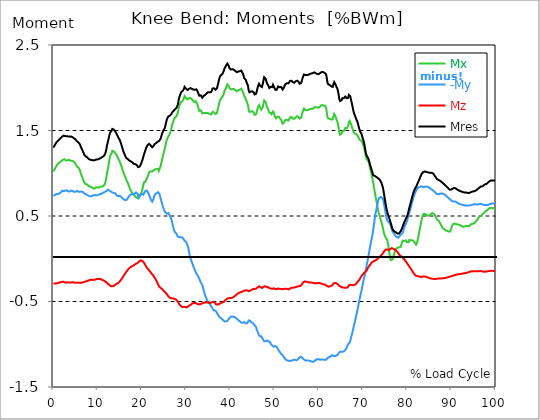
| Category |  Mx |  -My |  Mz |  Mres |
|---|---|---|---|---|
| 0.0 | 1.019 | 0.736 | -0.29 | 1.3 |
| 0.167348456675344 | 1.036 | 0.74 | -0.289 | 1.315 |
| 0.334696913350688 | 1.052 | 0.744 | -0.289 | 1.329 |
| 0.5020453700260321 | 1.068 | 0.75 | -0.288 | 1.345 |
| 0.669393826701376 | 1.083 | 0.757 | -0.288 | 1.361 |
| 0.83674228337672 | 1.097 | 0.756 | -0.286 | 1.37 |
| 1.0040907400520642 | 1.108 | 0.756 | -0.284 | 1.379 |
| 1.1621420602454444 | 1.117 | 0.758 | -0.283 | 1.386 |
| 1.3294905169207885 | 1.125 | 0.763 | -0.28 | 1.394 |
| 1.4968389735961325 | 1.132 | 0.77 | -0.277 | 1.403 |
| 1.6641874302714765 | 1.14 | 0.775 | -0.273 | 1.412 |
| 1.8315358869468206 | 1.144 | 0.786 | -0.272 | 1.42 |
| 1.9988843436221646 | 1.15 | 0.796 | -0.27 | 1.429 |
| 2.1662328002975086 | 1.158 | 0.795 | -0.269 | 1.436 |
| 2.333581256972853 | 1.167 | 0.79 | -0.27 | 1.44 |
| 2.5009297136481967 | 1.165 | 0.79 | -0.275 | 1.439 |
| 2.6682781703235405 | 1.153 | 0.797 | -0.279 | 1.435 |
| 2.8356266269988843 | 1.149 | 0.8 | -0.28 | 1.433 |
| 3.002975083674229 | 1.149 | 0.8 | -0.279 | 1.433 |
| 3.1703235403495724 | 1.151 | 0.798 | -0.276 | 1.433 |
| 3.337671997024917 | 1.154 | 0.789 | -0.276 | 1.431 |
| 3.4957233172182973 | 1.157 | 0.783 | -0.277 | 1.43 |
| 3.663071773893641 | 1.154 | 0.785 | -0.279 | 1.429 |
| 3.8304202305689854 | 1.149 | 0.793 | -0.279 | 1.428 |
| 3.997768687244329 | 1.147 | 0.798 | -0.278 | 1.429 |
| 4.165117143919673 | 1.145 | 0.798 | -0.276 | 1.427 |
| 4.332465600595017 | 1.141 | 0.793 | -0.274 | 1.421 |
| 4.499814057270361 | 1.141 | 0.785 | -0.275 | 1.417 |
| 4.667162513945706 | 1.132 | 0.783 | -0.277 | 1.41 |
| 4.834510970621049 | 1.122 | 0.782 | -0.278 | 1.402 |
| 5.001859427296393 | 1.112 | 0.783 | -0.281 | 1.395 |
| 5.169207883971737 | 1.094 | 0.79 | -0.28 | 1.384 |
| 5.336556340647081 | 1.079 | 0.793 | -0.28 | 1.374 |
| 5.503904797322425 | 1.072 | 0.79 | -0.278 | 1.367 |
| 5.671253253997769 | 1.067 | 0.784 | -0.279 | 1.36 |
| 5.82930457419115 | 1.058 | 0.781 | -0.28 | 1.352 |
| 5.996653030866494 | 1.037 | 0.783 | -0.282 | 1.338 |
| 6.164001487541838 | 1.003 | 0.786 | -0.282 | 1.314 |
| 6.331349944217181 | 0.98 | 0.786 | -0.28 | 1.296 |
| 6.498698400892526 | 0.958 | 0.783 | -0.279 | 1.278 |
| 6.66604685756787 | 0.93 | 0.781 | -0.278 | 1.256 |
| 6.833395314243213 | 0.91 | 0.778 | -0.276 | 1.239 |
| 7.000743770918558 | 0.888 | 0.764 | -0.271 | 1.215 |
| 7.168092227593902 | 0.883 | 0.759 | -0.268 | 1.207 |
| 7.335440684269246 | 0.873 | 0.756 | -0.265 | 1.197 |
| 7.50278914094459 | 0.867 | 0.752 | -0.263 | 1.191 |
| 7.6701375976199335 | 0.867 | 0.745 | -0.26 | 1.185 |
| 7.837486054295278 | 0.859 | 0.74 | -0.257 | 1.176 |
| 7.995537374488658 | 0.85 | 0.736 | -0.253 | 1.166 |
| 8.162885831164003 | 0.847 | 0.732 | -0.25 | 1.161 |
| 8.330234287839346 | 0.844 | 0.73 | -0.247 | 1.158 |
| 8.49758274451469 | 0.84 | 0.73 | -0.245 | 1.156 |
| 8.664931201190035 | 0.836 | 0.732 | -0.246 | 1.154 |
| 8.832279657865378 | 0.829 | 0.736 | -0.248 | 1.152 |
| 8.999628114540721 | 0.822 | 0.742 | -0.248 | 1.151 |
| 9.166976571216066 | 0.821 | 0.744 | -0.247 | 1.15 |
| 9.334325027891412 | 0.821 | 0.746 | -0.246 | 1.151 |
| 9.501673484566755 | 0.827 | 0.746 | -0.243 | 1.155 |
| 9.669021941242098 | 0.837 | 0.742 | -0.24 | 1.161 |
| 9.836370397917442 | 0.837 | 0.741 | -0.238 | 1.161 |
| 10.003718854592787 | 0.833 | 0.744 | -0.236 | 1.161 |
| 10.17106731126813 | 0.832 | 0.749 | -0.235 | 1.163 |
| 10.329118631461512 | 0.833 | 0.752 | -0.235 | 1.168 |
| 10.496467088136853 | 0.841 | 0.755 | -0.234 | 1.174 |
| 10.663815544812199 | 0.843 | 0.756 | -0.237 | 1.178 |
| 10.831164001487544 | 0.842 | 0.758 | -0.242 | 1.181 |
| 10.998512458162887 | 0.845 | 0.764 | -0.247 | 1.187 |
| 11.16586091483823 | 0.85 | 0.769 | -0.25 | 1.194 |
| 11.333209371513574 | 0.851 | 0.773 | -0.254 | 1.199 |
| 11.50055782818892 | 0.857 | 0.78 | -0.258 | 1.208 |
| 11.667906284864264 | 0.877 | 0.783 | -0.262 | 1.221 |
| 11.835254741539607 | 0.915 | 0.784 | -0.269 | 1.249 |
| 12.00260319821495 | 0.959 | 0.792 | -0.278 | 1.286 |
| 12.169951654890292 | 1.012 | 0.803 | -0.287 | 1.334 |
| 12.337300111565641 | 1.054 | 0.809 | -0.294 | 1.37 |
| 12.504648568240984 | 1.103 | 0.807 | -0.299 | 1.406 |
| 12.662699888434362 | 1.161 | 0.798 | -0.306 | 1.447 |
| 12.830048345109708 | 1.203 | 0.787 | -0.314 | 1.475 |
| 12.997396801785053 | 1.213 | 0.786 | -0.321 | 1.483 |
| 13.164745258460396 | 1.234 | 0.783 | -0.322 | 1.5 |
| 13.33209371513574 | 1.262 | 0.775 | -0.321 | 1.518 |
| 13.499442171811083 | 1.269 | 0.767 | -0.321 | 1.519 |
| 13.666790628486426 | 1.255 | 0.769 | -0.318 | 1.51 |
| 13.834139085161771 | 1.243 | 0.771 | -0.312 | 1.5 |
| 14.001487541837117 | 1.231 | 0.766 | -0.303 | 1.487 |
| 14.16883599851246 | 1.222 | 0.755 | -0.297 | 1.475 |
| 14.336184455187803 | 1.217 | 0.74 | -0.293 | 1.463 |
| 14.503532911863147 | 1.193 | 0.732 | -0.289 | 1.439 |
| 14.670881368538492 | 1.171 | 0.732 | -0.283 | 1.419 |
| 14.828932688731873 | 1.154 | 0.734 | -0.275 | 1.405 |
| 14.996281145407215 | 1.138 | 0.736 | -0.266 | 1.391 |
| 15.163629602082558 | 1.127 | 0.736 | -0.254 | 1.38 |
| 15.330978058757903 | 1.091 | 0.723 | -0.244 | 1.342 |
| 15.498326515433247 | 1.063 | 0.715 | -0.23 | 1.312 |
| 15.665674972108594 | 1.036 | 0.705 | -0.217 | 1.283 |
| 15.833023428783937 | 1.011 | 0.697 | -0.203 | 1.255 |
| 16.00037188545928 | 0.988 | 0.691 | -0.189 | 1.234 |
| 16.167720342134626 | 0.966 | 0.686 | -0.177 | 1.213 |
| 16.335068798809967 | 0.945 | 0.684 | -0.164 | 1.194 |
| 16.502417255485312 | 0.922 | 0.685 | -0.152 | 1.178 |
| 16.669765712160658 | 0.906 | 0.695 | -0.142 | 1.171 |
| 16.837114168836 | 0.886 | 0.709 | -0.13 | 1.166 |
| 17.004462625511344 | 0.863 | 0.723 | -0.118 | 1.159 |
| 17.16251394570472 | 0.839 | 0.732 | -0.107 | 1.15 |
| 17.32986240238007 | 0.815 | 0.744 | -0.103 | 1.143 |
| 17.497210859055414 | 0.799 | 0.75 | -0.098 | 1.139 |
| 17.664559315730756 | 0.783 | 0.756 | -0.092 | 1.134 |
| 17.8319077724061 | 0.77 | 0.76 | -0.087 | 1.128 |
| 17.999256229081443 | 0.756 | 0.757 | -0.083 | 1.118 |
| 18.166604685756788 | 0.745 | 0.755 | -0.078 | 1.11 |
| 18.333953142432133 | 0.737 | 0.761 | -0.071 | 1.107 |
| 18.501301599107478 | 0.73 | 0.771 | -0.064 | 1.108 |
| 18.668650055782823 | 0.718 | 0.775 | -0.058 | 1.103 |
| 18.835998512458165 | 0.711 | 0.775 | -0.053 | 1.097 |
| 19.00334696913351 | 0.71 | 0.759 | -0.05 | 1.085 |
| 19.170695425808855 | 0.718 | 0.737 | -0.043 | 1.072 |
| 19.338043882484197 | 0.749 | 0.713 | -0.034 | 1.069 |
| 19.496095202677576 | 0.742 | 0.727 | -0.025 | 1.077 |
| 19.66344365935292 | 0.75 | 0.743 | -0.02 | 1.093 |
| 19.830792116028263 | 0.762 | 0.754 | -0.018 | 1.112 |
| 19.998140572703612 | 0.784 | 0.76 | -0.022 | 1.134 |
| 20.165489029378953 | 0.821 | 0.752 | -0.029 | 1.159 |
| 20.3328374860543 | 0.861 | 0.75 | -0.036 | 1.19 |
| 20.500185942729644 | 0.896 | 0.749 | -0.046 | 1.223 |
| 20.667534399404985 | 0.894 | 0.78 | -0.061 | 1.247 |
| 20.83488285608033 | 0.902 | 0.796 | -0.078 | 1.273 |
| 21.002231312755672 | 0.926 | 0.793 | -0.093 | 1.3 |
| 21.16957976943102 | 0.938 | 0.795 | -0.107 | 1.315 |
| 21.336928226106362 | 0.961 | 0.786 | -0.117 | 1.331 |
| 21.504276682781704 | 0.988 | 0.766 | -0.127 | 1.341 |
| 21.67162513945705 | 1.011 | 0.744 | -0.137 | 1.344 |
| 21.82967645965043 | 1.022 | 0.723 | -0.148 | 1.34 |
| 21.997024916325774 | 1.022 | 0.698 | -0.159 | 1.325 |
| 22.16437337300112 | 1.022 | 0.682 | -0.171 | 1.315 |
| 22.33172182967646 | 1.02 | 0.668 | -0.181 | 1.304 |
| 22.499070286351806 | 1.022 | 0.668 | -0.19 | 1.303 |
| 22.666418743027148 | 1.034 | 0.701 | -0.204 | 1.32 |
| 22.833767199702496 | 1.045 | 0.739 | -0.217 | 1.339 |
| 23.00111565637784 | 1.047 | 0.753 | -0.23 | 1.346 |
| 23.168464113053183 | 1.047 | 0.761 | -0.244 | 1.35 |
| 23.335812569728528 | 1.049 | 0.767 | -0.261 | 1.357 |
| 23.50316102640387 | 1.051 | 0.772 | -0.28 | 1.367 |
| 23.670509483079215 | 1.051 | 0.779 | -0.298 | 1.376 |
| 23.83785793975456 | 1.029 | 0.787 | -0.317 | 1.375 |
| 23.995909259947936 | 1.05 | 0.757 | -0.329 | 1.384 |
| 24.163257716623285 | 1.071 | 0.722 | -0.339 | 1.395 |
| 24.330606173298627 | 1.102 | 0.69 | -0.346 | 1.419 |
| 24.49795462997397 | 1.143 | 0.658 | -0.351 | 1.449 |
| 24.665303086649313 | 1.181 | 0.629 | -0.358 | 1.475 |
| 24.83265154332466 | 1.217 | 0.601 | -0.367 | 1.497 |
| 25.0 | 1.247 | 0.575 | -0.379 | 1.503 |
| 25.167348456675345 | 1.282 | 0.555 | -0.386 | 1.525 |
| 25.334696913350694 | 1.32 | 0.541 | -0.395 | 1.558 |
| 25.502045370026035 | 1.363 | 0.531 | -0.404 | 1.597 |
| 25.669393826701377 | 1.396 | 0.526 | -0.416 | 1.629 |
| 25.836742283376722 | 1.414 | 0.531 | -0.428 | 1.65 |
| 26.004090740052067 | 1.429 | 0.535 | -0.44 | 1.665 |
| 26.17143919672741 | 1.446 | 0.519 | -0.45 | 1.669 |
| 26.329490516920792 | 1.464 | 0.505 | -0.455 | 1.673 |
| 26.49683897359613 | 1.484 | 0.486 | -0.459 | 1.676 |
| 26.66418743027148 | 1.521 | 0.46 | -0.461 | 1.691 |
| 26.831535886946828 | 1.562 | 0.432 | -0.463 | 1.712 |
| 26.998884343622166 | 1.591 | 0.389 | -0.463 | 1.718 |
| 27.166232800297514 | 1.616 | 0.358 | -0.465 | 1.729 |
| 27.333581256972852 | 1.639 | 0.327 | -0.466 | 1.74 |
| 27.5009297136482 | 1.651 | 0.312 | -0.471 | 1.749 |
| 27.668278170323543 | 1.66 | 0.302 | -0.477 | 1.756 |
| 27.835626626998888 | 1.667 | 0.293 | -0.483 | 1.764 |
| 28.002975083674233 | 1.69 | 0.272 | -0.488 | 1.784 |
| 28.170323540349575 | 1.711 | 0.257 | -0.502 | 1.807 |
| 28.33767199702492 | 1.757 | 0.248 | -0.519 | 1.855 |
| 28.50502045370026 | 1.79 | 0.252 | -0.534 | 1.893 |
| 28.663071773893645 | 1.812 | 0.253 | -0.542 | 1.917 |
| 28.830420230568986 | 1.832 | 0.252 | -0.552 | 1.941 |
| 28.99776868724433 | 1.842 | 0.251 | -0.561 | 1.954 |
| 29.165117143919673 | 1.843 | 0.249 | -0.565 | 1.958 |
| 29.33246560059502 | 1.853 | 0.24 | -0.565 | 1.969 |
| 29.499814057270367 | 1.873 | 0.225 | -0.562 | 1.985 |
| 29.66716251394571 | 1.903 | 0.21 | -0.56 | 2.011 |
| 29.834510970621054 | 1.893 | 0.206 | -0.564 | 2.002 |
| 30.00185942729639 | 1.88 | 0.198 | -0.568 | 1.989 |
| 30.169207883971744 | 1.868 | 0.188 | -0.57 | 1.979 |
| 30.33655634064708 | 1.864 | 0.16 | -0.563 | 1.974 |
| 30.50390479732243 | 1.873 | 0.13 | -0.556 | 1.98 |
| 30.671253253997772 | 1.879 | 0.086 | -0.55 | 1.986 |
| 30.829304574191156 | 1.877 | 0.036 | -0.545 | 1.988 |
| 30.996653030866494 | 1.88 | 0.002 | -0.543 | 1.997 |
| 31.164001487541842 | 1.872 | -0.018 | -0.535 | 1.992 |
| 31.331349944217187 | 1.862 | -0.042 | -0.526 | 1.986 |
| 31.498698400892525 | 1.853 | -0.066 | -0.519 | 1.982 |
| 31.666046857567874 | 1.845 | -0.092 | -0.519 | 1.979 |
| 31.833395314243212 | 1.832 | -0.113 | -0.518 | 1.97 |
| 32.00074377091856 | 1.838 | -0.124 | -0.518 | 1.977 |
| 32.1680922275939 | 1.843 | -0.15 | -0.518 | 1.986 |
| 32.33544068426925 | 1.83 | -0.172 | -0.523 | 1.982 |
| 32.50278914094459 | 1.814 | -0.185 | -0.527 | 1.969 |
| 32.670137597619934 | 1.787 | -0.199 | -0.531 | 1.949 |
| 32.83748605429528 | 1.756 | -0.215 | -0.534 | 1.926 |
| 33.004834510970625 | 1.729 | -0.235 | -0.537 | 1.907 |
| 33.162885831164004 | 1.73 | -0.255 | -0.532 | 1.906 |
| 33.33023428783935 | 1.735 | -0.279 | -0.527 | 1.912 |
| 33.497582744514695 | 1.722 | -0.291 | -0.524 | 1.901 |
| 33.664931201190036 | 1.7 | -0.309 | -0.521 | 1.883 |
| 33.83227965786538 | 1.698 | -0.337 | -0.517 | 1.888 |
| 33.99962811454073 | 1.705 | -0.373 | -0.513 | 1.906 |
| 34.16697657121607 | 1.701 | -0.402 | -0.513 | 1.907 |
| 34.33432502789141 | 1.703 | -0.429 | -0.511 | 1.917 |
| 34.50167348456676 | 1.705 | -0.452 | -0.51 | 1.927 |
| 34.6690219412421 | 1.705 | -0.474 | -0.512 | 1.935 |
| 34.83637039791744 | 1.704 | -0.495 | -0.513 | 1.942 |
| 35.00371885459279 | 1.703 | -0.511 | -0.514 | 1.949 |
| 35.17106731126814 | 1.7 | -0.517 | -0.516 | 1.95 |
| 35.338415767943474 | 1.694 | -0.527 | -0.517 | 1.947 |
| 35.49646708813686 | 1.688 | -0.54 | -0.517 | 1.945 |
| 35.6638155448122 | 1.686 | -0.553 | -0.513 | 1.95 |
| 35.831164001487544 | 1.698 | -0.568 | -0.51 | 1.967 |
| 35.998512458162885 | 1.718 | -0.585 | -0.506 | 1.992 |
| 36.165860914838234 | 1.723 | -0.595 | -0.503 | 2.002 |
| 36.333209371513576 | 1.71 | -0.605 | -0.509 | 1.993 |
| 36.50055782818892 | 1.702 | -0.607 | -0.515 | 1.985 |
| 36.667906284864266 | 1.692 | -0.607 | -0.523 | 1.977 |
| 36.83525474153961 | 1.689 | -0.62 | -0.535 | 1.978 |
| 37.002603198214956 | 1.709 | -0.63 | -0.538 | 1.996 |
| 37.1699516548903 | 1.746 | -0.65 | -0.535 | 2.03 |
| 37.337300111565646 | 1.782 | -0.666 | -0.534 | 2.066 |
| 37.50464856824098 | 1.822 | -0.677 | -0.529 | 2.105 |
| 37.66269988843437 | 1.849 | -0.687 | -0.524 | 2.129 |
| 37.83004834510971 | 1.867 | -0.694 | -0.519 | 2.145 |
| 37.99739680178505 | 1.882 | -0.698 | -0.516 | 2.155 |
| 38.16474525846039 | 1.888 | -0.701 | -0.512 | 2.158 |
| 38.33209371513574 | 1.903 | -0.715 | -0.511 | 2.172 |
| 38.49944217181109 | 1.926 | -0.724 | -0.506 | 2.193 |
| 38.666790628486424 | 1.957 | -0.732 | -0.496 | 2.22 |
| 38.83413908516178 | 1.978 | -0.735 | -0.487 | 2.239 |
| 39.001487541837115 | 1.993 | -0.735 | -0.481 | 2.25 |
| 39.16883599851246 | 2.019 | -0.733 | -0.473 | 2.27 |
| 39.336184455187805 | 2.04 | -0.726 | -0.466 | 2.283 |
| 39.503532911863154 | 2.031 | -0.717 | -0.462 | 2.269 |
| 39.670881368538495 | 2.017 | -0.706 | -0.459 | 2.253 |
| 39.83822982521384 | 1.994 | -0.692 | -0.459 | 2.228 |
| 39.996281145407224 | 1.986 | -0.683 | -0.46 | 2.219 |
| 40.163629602082565 | 1.981 | -0.676 | -0.46 | 2.213 |
| 40.33097805875791 | 1.977 | -0.672 | -0.459 | 2.208 |
| 40.498326515433256 | 1.986 | -0.677 | -0.455 | 2.217 |
| 40.6656749721086 | 1.986 | -0.677 | -0.451 | 2.217 |
| 40.83302342878393 | 1.983 | -0.678 | -0.444 | 2.211 |
| 41.00037188545929 | 1.975 | -0.682 | -0.434 | 2.2 |
| 41.16772034213463 | 1.969 | -0.687 | -0.43 | 2.194 |
| 41.33506879880997 | 1.963 | -0.695 | -0.421 | 2.188 |
| 41.50241725548531 | 1.958 | -0.704 | -0.416 | 2.183 |
| 41.66976571216066 | 1.959 | -0.713 | -0.41 | 2.183 |
| 41.837114168836 | 1.973 | -0.717 | -0.402 | 2.191 |
| 42.004462625511344 | 1.973 | -0.729 | -0.399 | 2.192 |
| 42.17181108218669 | 1.977 | -0.733 | -0.395 | 2.194 |
| 42.32986240238007 | 1.983 | -0.733 | -0.393 | 2.197 |
| 42.497210859055414 | 1.987 | -0.747 | -0.388 | 2.201 |
| 42.66455931573076 | 1.978 | -0.749 | -0.383 | 2.19 |
| 42.831907772406105 | 1.954 | -0.749 | -0.381 | 2.166 |
| 42.999256229081446 | 1.931 | -0.749 | -0.377 | 2.143 |
| 43.16660468575679 | 1.9 | -0.74 | -0.376 | 2.11 |
| 43.33395314243214 | 1.887 | -0.747 | -0.372 | 2.1 |
| 43.50130159910748 | 1.878 | -0.757 | -0.368 | 2.094 |
| 43.66865005578282 | 1.846 | -0.753 | -0.369 | 2.066 |
| 43.83599851245817 | 1.836 | -0.752 | -0.371 | 2.059 |
| 44.00334696913351 | 1.799 | -0.739 | -0.376 | 2.024 |
| 44.17069542580886 | 1.742 | -0.721 | -0.38 | 1.969 |
| 44.3380438824842 | 1.717 | -0.717 | -0.38 | 1.948 |
| 44.49609520267758 | 1.719 | -0.724 | -0.374 | 1.95 |
| 44.66344365935292 | 1.721 | -0.737 | -0.369 | 1.956 |
| 44.83079211602827 | 1.727 | -0.744 | -0.363 | 1.961 |
| 44.99814057270361 | 1.725 | -0.75 | -0.359 | 1.958 |
| 45.16548902937895 | 1.735 | -0.759 | -0.352 | 1.967 |
| 45.332837486054295 | 1.711 | -0.766 | -0.352 | 1.945 |
| 45.500185942729644 | 1.683 | -0.779 | -0.354 | 1.922 |
| 45.66753439940499 | 1.679 | -0.787 | -0.354 | 1.919 |
| 45.83488285608033 | 1.69 | -0.799 | -0.35 | 1.929 |
| 46.00223131275568 | 1.717 | -0.829 | -0.343 | 1.961 |
| 46.16957976943102 | 1.754 | -0.85 | -0.334 | 1.998 |
| 46.336928226106366 | 1.782 | -0.871 | -0.328 | 2.026 |
| 46.50427668278171 | 1.797 | -0.894 | -0.323 | 2.048 |
| 46.671625139457056 | 1.79 | -0.908 | -0.323 | 2.047 |
| 46.829676459650436 | 1.758 | -0.906 | -0.331 | 2.018 |
| 46.99702491632577 | 1.743 | -0.908 | -0.34 | 2.007 |
| 47.16437337300112 | 1.74 | -0.917 | -0.343 | 2.009 |
| 47.33172182967646 | 1.771 | -0.936 | -0.337 | 2.042 |
| 47.49907028635181 | 1.812 | -0.951 | -0.329 | 2.083 |
| 47.66641874302716 | 1.851 | -0.965 | -0.321 | 2.123 |
| 47.83376719970249 | 1.853 | -0.968 | -0.321 | 2.125 |
| 48.001115656377834 | 1.833 | -0.965 | -0.323 | 2.106 |
| 48.16846411305319 | 1.799 | -0.958 | -0.328 | 2.073 |
| 48.33581256972853 | 1.772 | -0.956 | -0.333 | 2.05 |
| 48.50316102640387 | 1.775 | -0.963 | -0.33 | 2.053 |
| 48.67050948307921 | 1.735 | -0.963 | -0.338 | 2.019 |
| 48.837857939754564 | 1.707 | -0.966 | -0.344 | 1.997 |
| 49.005206396429905 | 1.707 | -0.979 | -0.346 | 2.001 |
| 49.163257716623285 | 1.708 | -0.996 | -0.349 | 2.011 |
| 49.33060617329863 | 1.691 | -1.005 | -0.351 | 2.001 |
| 49.49795462997397 | 1.695 | -1.015 | -0.35 | 2.008 |
| 49.66530308664932 | 1.722 | -1.024 | -0.344 | 2.035 |
| 49.832651543324666 | 1.709 | -1.029 | -0.346 | 2.025 |
| 50.0 | 1.677 | -1.025 | -0.351 | 1.997 |
| 50.16734845667534 | 1.655 | -1.022 | -0.354 | 1.978 |
| 50.33469691335069 | 1.643 | -1.02 | -0.357 | 1.967 |
| 50.50204537002604 | 1.649 | -1.03 | -0.355 | 1.977 |
| 50.66939382670139 | 1.662 | -1.048 | -0.351 | 1.997 |
| 50.836742283376715 | 1.673 | -1.064 | -0.348 | 2.016 |
| 51.00409074005207 | 1.658 | -1.076 | -0.35 | 2.01 |
| 51.17143919672741 | 1.646 | -1.086 | -0.352 | 2.006 |
| 51.32949051692079 | 1.637 | -1.101 | -0.352 | 2.009 |
| 51.496838973596134 | 1.626 | -1.115 | -0.352 | 2.01 |
| 51.66418743027148 | 1.604 | -1.121 | -0.354 | 1.995 |
| 51.831535886946824 | 1.581 | -1.127 | -0.356 | 1.98 |
| 51.99888434362217 | 1.579 | -1.137 | -0.355 | 1.983 |
| 52.16623280029752 | 1.593 | -1.152 | -0.353 | 2.005 |
| 52.33358125697285 | 1.612 | -1.168 | -0.35 | 2.029 |
| 52.5009297136482 | 1.625 | -1.177 | -0.35 | 2.046 |
| 52.668278170323546 | 1.632 | -1.185 | -0.35 | 2.056 |
| 52.835626626998895 | 1.623 | -1.19 | -0.353 | 2.052 |
| 53.00297508367424 | 1.615 | -1.191 | -0.358 | 2.047 |
| 53.17032354034958 | 1.617 | -1.193 | -0.358 | 2.051 |
| 53.33767199702492 | 1.633 | -1.192 | -0.355 | 2.063 |
| 53.50502045370027 | 1.651 | -1.195 | -0.349 | 2.08 |
| 53.663071773893655 | 1.662 | -1.195 | -0.343 | 2.087 |
| 53.83042023056899 | 1.657 | -1.193 | -0.338 | 2.082 |
| 53.99776868724433 | 1.649 | -1.189 | -0.338 | 2.073 |
| 54.16511714391967 | 1.64 | -1.185 | -0.338 | 2.063 |
| 54.33246560059503 | 1.635 | -1.183 | -0.338 | 2.058 |
| 54.49981405727037 | 1.637 | -1.183 | -0.337 | 2.059 |
| 54.667162513945705 | 1.638 | -1.183 | -0.337 | 2.06 |
| 54.834510970621054 | 1.657 | -1.185 | -0.331 | 2.078 |
| 55.0018594272964 | 1.664 | -1.187 | -0.327 | 2.084 |
| 55.169207883971744 | 1.667 | -1.182 | -0.324 | 2.083 |
| 55.336556340647086 | 1.668 | -1.174 | -0.321 | 2.081 |
| 55.50390479732243 | 1.655 | -1.164 | -0.32 | 2.065 |
| 55.671253253997776 | 1.639 | -1.154 | -0.32 | 2.048 |
| 55.83860171067312 | 1.636 | -1.147 | -0.318 | 2.041 |
| 55.9966530308665 | 1.65 | -1.147 | -0.312 | 2.053 |
| 56.16400148754184 | 1.681 | -1.153 | -0.3 | 2.081 |
| 56.33134994421718 | 1.712 | -1.163 | -0.288 | 2.112 |
| 56.498698400892536 | 1.735 | -1.171 | -0.277 | 2.134 |
| 56.66604685756788 | 1.756 | -1.178 | -0.265 | 2.155 |
| 56.83339531424321 | 1.748 | -1.183 | -0.265 | 2.152 |
| 57.00074377091856 | 1.738 | -1.189 | -0.266 | 2.15 |
| 57.16809222759391 | 1.735 | -1.19 | -0.268 | 2.149 |
| 57.33544068426925 | 1.736 | -1.19 | -0.271 | 2.149 |
| 57.5027891409446 | 1.738 | -1.189 | -0.274 | 2.15 |
| 57.670137597619934 | 1.741 | -1.189 | -0.276 | 2.151 |
| 57.83748605429528 | 1.745 | -1.189 | -0.277 | 2.153 |
| 58.004834510970625 | 1.75 | -1.194 | -0.278 | 2.161 |
| 58.16288583116401 | 1.754 | -1.198 | -0.278 | 2.166 |
| 58.330234287839346 | 1.754 | -1.201 | -0.277 | 2.167 |
| 58.497582744514695 | 1.754 | -1.203 | -0.28 | 2.169 |
| 58.66493120119004 | 1.754 | -1.205 | -0.283 | 2.171 |
| 58.832279657865385 | 1.763 | -1.206 | -0.283 | 2.177 |
| 58.999628114540734 | 1.772 | -1.2 | -0.285 | 2.18 |
| 59.16697657121607 | 1.777 | -1.192 | -0.287 | 2.178 |
| 59.33432502789142 | 1.773 | -1.183 | -0.289 | 2.169 |
| 59.50167348456676 | 1.772 | -1.179 | -0.287 | 2.165 |
| 59.66902194124211 | 1.771 | -1.174 | -0.285 | 2.161 |
| 59.83637039791745 | 1.769 | -1.175 | -0.284 | 2.16 |
| 60.00371885459278 | 1.767 | -1.176 | -0.283 | 2.159 |
| 60.17106731126813 | 1.768 | -1.178 | -0.283 | 2.161 |
| 60.33841576794349 | 1.781 | -1.182 | -0.286 | 2.173 |
| 60.49646708813685 | 1.793 | -1.185 | -0.288 | 2.184 |
| 60.6638155448122 | 1.798 | -1.177 | -0.292 | 2.183 |
| 60.831164001487544 | 1.797 | -1.175 | -0.297 | 2.182 |
| 60.99851245816289 | 1.795 | -1.181 | -0.298 | 2.183 |
| 61.16586091483824 | 1.79 | -1.182 | -0.3 | 2.18 |
| 61.333209371513576 | 1.784 | -1.18 | -0.303 | 2.174 |
| 61.50055782818892 | 1.787 | -1.182 | -0.304 | 2.178 |
| 61.667906284864266 | 1.764 | -1.182 | -0.309 | 2.158 |
| 61.835254741539615 | 1.709 | -1.172 | -0.317 | 2.107 |
| 62.002603198214956 | 1.654 | -1.16 | -0.326 | 2.055 |
| 62.16995165489029 | 1.639 | -1.155 | -0.327 | 2.04 |
| 62.33730011156564 | 1.635 | -1.152 | -0.326 | 2.034 |
| 62.504648568240995 | 1.637 | -1.15 | -0.323 | 2.032 |
| 62.67199702491633 | 1.638 | -1.144 | -0.321 | 2.029 |
| 62.83004834510971 | 1.629 | -1.134 | -0.317 | 2.016 |
| 62.99739680178505 | 1.62 | -1.126 | -0.313 | 2.004 |
| 63.1647452584604 | 1.63 | -1.127 | -0.305 | 2.01 |
| 63.33209371513575 | 1.67 | -1.137 | -0.29 | 2.045 |
| 63.4994421718111 | 1.695 | -1.142 | -0.283 | 2.067 |
| 63.666790628486424 | 1.684 | -1.139 | -0.283 | 2.057 |
| 63.83413908516177 | 1.657 | -1.136 | -0.284 | 2.035 |
| 64.00148754183712 | 1.632 | -1.132 | -0.286 | 2.012 |
| 64.16883599851248 | 1.613 | -1.127 | -0.292 | 1.995 |
| 64.3361844551878 | 1.583 | -1.12 | -0.3 | 1.968 |
| 64.50353291186315 | 1.531 | -1.107 | -0.309 | 1.918 |
| 64.6708813685385 | 1.473 | -1.094 | -0.317 | 1.865 |
| 64.83822982521384 | 1.45 | -1.088 | -0.321 | 1.844 |
| 65.00557828188919 | 1.458 | -1.086 | -0.329 | 1.85 |
| 65.16362960208257 | 1.465 | -1.083 | -0.335 | 1.854 |
| 65.3309780587579 | 1.49 | -1.088 | -0.334 | 1.877 |
| 65.49832651543326 | 1.5 | -1.095 | -0.333 | 1.888 |
| 65.6656749721086 | 1.493 | -1.084 | -0.338 | 1.878 |
| 65.83302342878395 | 1.508 | -1.075 | -0.338 | 1.883 |
| 66.00037188545929 | 1.529 | -1.068 | -0.339 | 1.897 |
| 66.16772034213463 | 1.531 | -1.054 | -0.338 | 1.892 |
| 66.33506879880998 | 1.526 | -1.036 | -0.339 | 1.879 |
| 66.50241725548531 | 1.534 | -1.015 | -0.335 | 1.874 |
| 66.66976571216065 | 1.555 | -0.998 | -0.326 | 1.882 |
| 66.83711416883601 | 1.599 | -0.998 | -0.309 | 1.916 |
| 67.00446262551135 | 1.613 | -0.981 | -0.304 | 1.918 |
| 67.1718110821867 | 1.601 | -0.953 | -0.305 | 1.895 |
| 67.32986240238007 | 1.569 | -0.915 | -0.308 | 1.85 |
| 67.49721085905541 | 1.546 | -0.885 | -0.307 | 1.816 |
| 67.66455931573076 | 1.517 | -0.85 | -0.309 | 1.773 |
| 67.83190777240611 | 1.487 | -0.814 | -0.311 | 1.731 |
| 67.99925622908145 | 1.472 | -0.776 | -0.309 | 1.699 |
| 68.16660468575678 | 1.466 | -0.738 | -0.304 | 1.677 |
| 68.33395314243214 | 1.46 | -0.699 | -0.299 | 1.653 |
| 68.50130159910749 | 1.453 | -0.66 | -0.29 | 1.63 |
| 68.66865005578282 | 1.451 | -0.62 | -0.279 | 1.614 |
| 68.83599851245816 | 1.442 | -0.58 | -0.268 | 1.588 |
| 69.00334696913352 | 1.42 | -0.536 | -0.257 | 1.553 |
| 69.17069542580886 | 1.401 | -0.491 | -0.247 | 1.519 |
| 69.3380438824842 | 1.388 | -0.45 | -0.234 | 1.493 |
| 69.50539233915956 | 1.383 | -0.412 | -0.217 | 1.475 |
| 69.66344365935292 | 1.38 | -0.375 | -0.202 | 1.46 |
| 69.83079211602826 | 1.358 | -0.329 | -0.191 | 1.43 |
| 69.99814057270362 | 1.338 | -0.285 | -0.182 | 1.402 |
| 70.16548902937896 | 1.318 | -0.246 | -0.172 | 1.376 |
| 70.33283748605429 | 1.283 | -0.207 | -0.162 | 1.334 |
| 70.50018594272964 | 1.235 | -0.168 | -0.156 | 1.283 |
| 70.667534399405 | 1.191 | -0.12 | -0.149 | 1.235 |
| 70.83488285608033 | 1.166 | -0.076 | -0.136 | 1.207 |
| 71.00223131275568 | 1.155 | -0.034 | -0.119 | 1.192 |
| 71.16957976943102 | 1.144 | 0.01 | -0.103 | 1.178 |
| 71.33692822610637 | 1.122 | 0.057 | -0.089 | 1.155 |
| 71.50427668278171 | 1.086 | 0.107 | -0.078 | 1.122 |
| 71.67162513945706 | 1.046 | 0.156 | -0.066 | 1.086 |
| 71.8389735961324 | 1.01 | 0.2 | -0.054 | 1.062 |
| 71.99702491632577 | 0.973 | 0.239 | -0.042 | 1.033 |
| 72.16437337300113 | 0.933 | 0.283 | -0.033 | 1.005 |
| 72.33172182967647 | 0.885 | 0.342 | -0.032 | 0.976 |
| 72.49907028635181 | 0.833 | 0.405 | -0.029 | 0.968 |
| 72.66641874302715 | 0.782 | 0.467 | -0.024 | 0.97 |
| 72.8337671997025 | 0.731 | 0.525 | -0.018 | 0.969 |
| 73.00111565637783 | 0.686 | 0.567 | -0.013 | 0.957 |
| 73.16846411305319 | 0.64 | 0.61 | -0.006 | 0.95 |
| 73.33581256972853 | 0.593 | 0.652 | 0.001 | 0.944 |
| 73.50316102640387 | 0.55 | 0.691 | 0.008 | 0.938 |
| 73.67050948307921 | 0.519 | 0.709 | 0.017 | 0.932 |
| 73.83785793975457 | 0.492 | 0.718 | 0.024 | 0.922 |
| 74.00520639642991 | 0.461 | 0.722 | 0.032 | 0.908 |
| 74.16325771662328 | 0.428 | 0.725 | 0.041 | 0.889 |
| 74.33060617329863 | 0.398 | 0.713 | 0.051 | 0.863 |
| 74.49795462997398 | 0.363 | 0.7 | 0.063 | 0.833 |
| 74.66530308664932 | 0.317 | 0.67 | 0.077 | 0.789 |
| 74.83265154332466 | 0.285 | 0.622 | 0.09 | 0.735 |
| 75.00000000000001 | 0.263 | 0.572 | 0.102 | 0.681 |
| 75.16734845667534 | 0.246 | 0.524 | 0.108 | 0.63 |
| 75.3346969133507 | 0.236 | 0.48 | 0.108 | 0.585 |
| 75.50204537002605 | 0.217 | 0.446 | 0.107 | 0.546 |
| 75.66939382670138 | 0.179 | 0.437 | 0.103 | 0.517 |
| 75.83674228337672 | 0.115 | 0.43 | 0.104 | 0.49 |
| 76.00409074005208 | 0.055 | 0.422 | 0.107 | 0.466 |
| 76.17143919672742 | 0.006 | 0.405 | 0.112 | 0.438 |
| 76.33878765340276 | -0.016 | 0.381 | 0.118 | 0.411 |
| 76.49683897359614 | -0.02 | 0.348 | 0.124 | 0.379 |
| 76.66418743027148 | -0.009 | 0.32 | 0.123 | 0.35 |
| 76.83153588694682 | 0.013 | 0.308 | 0.118 | 0.333 |
| 76.99888434362218 | 0.046 | 0.299 | 0.112 | 0.325 |
| 77.16623280029752 | 0.079 | 0.283 | 0.108 | 0.317 |
| 77.33358125697285 | 0.103 | 0.267 | 0.104 | 0.31 |
| 77.5009297136482 | 0.117 | 0.261 | 0.095 | 0.308 |
| 77.66827817032356 | 0.124 | 0.252 | 0.086 | 0.301 |
| 77.83562662699889 | 0.129 | 0.248 | 0.077 | 0.294 |
| 78.00297508367423 | 0.133 | 0.248 | 0.065 | 0.292 |
| 78.17032354034959 | 0.135 | 0.252 | 0.052 | 0.295 |
| 78.33767199702493 | 0.132 | 0.266 | 0.04 | 0.305 |
| 78.50502045370027 | 0.138 | 0.282 | 0.032 | 0.319 |
| 78.67236891037561 | 0.165 | 0.28 | 0.027 | 0.33 |
| 78.83042023056899 | 0.188 | 0.292 | 0.019 | 0.354 |
| 78.99776868724433 | 0.212 | 0.306 | 0.011 | 0.379 |
| 79.16511714391969 | 0.211 | 0.337 | 0.002 | 0.403 |
| 79.33246560059503 | 0.208 | 0.366 | -0.007 | 0.425 |
| 79.49981405727036 | 0.205 | 0.387 | -0.018 | 0.444 |
| 79.66716251394571 | 0.215 | 0.404 | -0.03 | 0.464 |
| 79.83451097062107 | 0.206 | 0.424 | -0.043 | 0.483 |
| 80.00185942729641 | 0.192 | 0.448 | -0.055 | 0.499 |
| 80.16920788397174 | 0.186 | 0.482 | -0.067 | 0.527 |
| 80.33655634064709 | 0.194 | 0.517 | -0.079 | 0.563 |
| 80.50390479732243 | 0.221 | 0.542 | -0.092 | 0.6 |
| 80.67125325399778 | 0.224 | 0.57 | -0.105 | 0.63 |
| 80.83860171067312 | 0.217 | 0.601 | -0.117 | 0.661 |
| 80.99665303086651 | 0.213 | 0.638 | -0.13 | 0.697 |
| 81.16400148754184 | 0.216 | 0.671 | -0.146 | 0.73 |
| 81.3313499442172 | 0.213 | 0.699 | -0.158 | 0.76 |
| 81.49869840089255 | 0.205 | 0.727 | -0.171 | 0.785 |
| 81.66604685756786 | 0.193 | 0.752 | -0.183 | 0.808 |
| 81.83339531424322 | 0.179 | 0.773 | -0.191 | 0.824 |
| 82.00074377091858 | 0.165 | 0.792 | -0.199 | 0.839 |
| 82.16809222759392 | 0.178 | 0.81 | -0.202 | 0.858 |
| 82.33544068426926 | 0.21 | 0.824 | -0.203 | 0.879 |
| 82.50278914094459 | 0.25 | 0.832 | -0.206 | 0.898 |
| 82.67013759761994 | 0.297 | 0.838 | -0.208 | 0.918 |
| 82.83748605429528 | 0.344 | 0.841 | -0.211 | 0.939 |
| 83.00483451097062 | 0.387 | 0.844 | -0.213 | 0.961 |
| 83.17218296764597 | 0.431 | 0.845 | -0.213 | 0.981 |
| 83.33023428783935 | 0.471 | 0.844 | -0.212 | 0.997 |
| 83.4975827445147 | 0.504 | 0.84 | -0.209 | 1.009 |
| 83.66493120119004 | 0.522 | 0.837 | -0.208 | 1.016 |
| 83.83227965786537 | 0.525 | 0.836 | -0.207 | 1.016 |
| 83.99962811454073 | 0.525 | 0.842 | -0.208 | 1.019 |
| 84.16697657121607 | 0.516 | 0.844 | -0.211 | 1.017 |
| 84.33432502789142 | 0.512 | 0.845 | -0.212 | 1.017 |
| 84.50167348456677 | 0.508 | 0.844 | -0.215 | 1.015 |
| 84.6690219412421 | 0.506 | 0.84 | -0.217 | 1.011 |
| 84.83637039791745 | 0.503 | 0.836 | -0.222 | 1.008 |
| 85.0037188545928 | 0.504 | 0.831 | -0.226 | 1.006 |
| 85.17106731126813 | 0.51 | 0.825 | -0.229 | 1.005 |
| 85.33841576794349 | 0.521 | 0.817 | -0.23 | 1.005 |
| 85.50576422461883 | 0.53 | 0.811 | -0.232 | 1.005 |
| 85.66381554481221 | 0.534 | 0.806 | -0.234 | 1.004 |
| 85.83116400148755 | 0.533 | 0.802 | -0.236 | 1.001 |
| 85.99851245816289 | 0.526 | 0.793 | -0.236 | 0.989 |
| 86.16586091483823 | 0.516 | 0.783 | -0.236 | 0.976 |
| 86.33320937151358 | 0.502 | 0.776 | -0.237 | 0.964 |
| 86.50055782818893 | 0.485 | 0.768 | -0.235 | 0.95 |
| 86.66790628486427 | 0.469 | 0.759 | -0.234 | 0.936 |
| 86.83525474153961 | 0.454 | 0.752 | -0.232 | 0.924 |
| 87.00260319821496 | 0.45 | 0.753 | -0.232 | 0.922 |
| 87.16995165489031 | 0.442 | 0.755 | -0.232 | 0.92 |
| 87.33730011156564 | 0.428 | 0.758 | -0.231 | 0.916 |
| 87.504648568241 | 0.411 | 0.761 | -0.231 | 0.909 |
| 87.67199702491634 | 0.393 | 0.763 | -0.23 | 0.903 |
| 87.83004834510972 | 0.378 | 0.763 | -0.23 | 0.895 |
| 87.99739680178506 | 0.361 | 0.763 | -0.229 | 0.887 |
| 88.1647452584604 | 0.354 | 0.759 | -0.228 | 0.88 |
| 88.33209371513574 | 0.349 | 0.754 | -0.227 | 0.873 |
| 88.49944217181108 | 0.339 | 0.75 | -0.226 | 0.865 |
| 88.66679062848644 | 0.333 | 0.743 | -0.224 | 0.856 |
| 88.83413908516178 | 0.329 | 0.735 | -0.221 | 0.847 |
| 89.00148754183712 | 0.327 | 0.727 | -0.219 | 0.839 |
| 89.16883599851246 | 0.325 | 0.719 | -0.216 | 0.83 |
| 89.33618445518782 | 0.319 | 0.712 | -0.214 | 0.821 |
| 89.50353291186315 | 0.314 | 0.704 | -0.212 | 0.813 |
| 89.6708813685385 | 0.317 | 0.695 | -0.209 | 0.807 |
| 89.83822982521386 | 0.334 | 0.689 | -0.206 | 0.807 |
| 90.00557828188919 | 0.358 | 0.681 | -0.205 | 0.81 |
| 90.16362960208257 | 0.385 | 0.672 | -0.202 | 0.817 |
| 90.3309780587579 | 0.402 | 0.67 | -0.198 | 0.822 |
| 90.49832651543326 | 0.413 | 0.67 | -0.194 | 0.827 |
| 90.66567497210859 | 0.413 | 0.67 | -0.192 | 0.828 |
| 90.83302342878395 | 0.412 | 0.669 | -0.189 | 0.826 |
| 91.00037188545929 | 0.406 | 0.667 | -0.188 | 0.822 |
| 91.16772034213463 | 0.4 | 0.662 | -0.186 | 0.816 |
| 91.33506879880998 | 0.401 | 0.655 | -0.183 | 0.81 |
| 91.50241725548533 | 0.402 | 0.65 | -0.183 | 0.805 |
| 91.66976571216065 | 0.399 | 0.645 | -0.182 | 0.799 |
| 91.83711416883601 | 0.394 | 0.64 | -0.181 | 0.794 |
| 92.00446262551137 | 0.392 | 0.637 | -0.179 | 0.791 |
| 92.1718110821867 | 0.39 | 0.635 | -0.177 | 0.789 |
| 92.33915953886203 | 0.383 | 0.634 | -0.176 | 0.785 |
| 92.49721085905541 | 0.378 | 0.631 | -0.174 | 0.782 |
| 92.66455931573077 | 0.372 | 0.629 | -0.172 | 0.779 |
| 92.83190777240611 | 0.373 | 0.627 | -0.171 | 0.777 |
| 92.99925622908145 | 0.378 | 0.622 | -0.169 | 0.775 |
| 93.1666046857568 | 0.381 | 0.621 | -0.168 | 0.775 |
| 93.33395314243214 | 0.383 | 0.622 | -0.166 | 0.775 |
| 93.50130159910749 | 0.383 | 0.622 | -0.163 | 0.773 |
| 93.66865005578283 | 0.383 | 0.622 | -0.16 | 0.771 |
| 93.83599851245818 | 0.381 | 0.622 | -0.158 | 0.769 |
| 94.00334696913353 | 0.381 | 0.623 | -0.155 | 0.768 |
| 94.17069542580886 | 0.389 | 0.624 | -0.152 | 0.773 |
| 94.3380438824842 | 0.398 | 0.626 | -0.15 | 0.778 |
| 94.50539233915954 | 0.405 | 0.628 | -0.148 | 0.782 |
| 94.66344365935292 | 0.41 | 0.631 | -0.146 | 0.785 |
| 94.83079211602828 | 0.41 | 0.634 | -0.146 | 0.786 |
| 94.99814057270362 | 0.41 | 0.637 | -0.146 | 0.787 |
| 95.16548902937897 | 0.414 | 0.638 | -0.146 | 0.789 |
| 95.33283748605432 | 0.423 | 0.637 | -0.146 | 0.793 |
| 95.50018594272963 | 0.435 | 0.636 | -0.146 | 0.798 |
| 95.66753439940499 | 0.446 | 0.635 | -0.147 | 0.803 |
| 95.83488285608034 | 0.457 | 0.635 | -0.147 | 0.81 |
| 96.00223131275567 | 0.469 | 0.636 | -0.146 | 0.817 |
| 96.16957976943102 | 0.481 | 0.637 | -0.145 | 0.824 |
| 96.33692822610638 | 0.491 | 0.639 | -0.145 | 0.832 |
| 96.50427668278171 | 0.498 | 0.641 | -0.145 | 0.839 |
| 96.67162513945706 | 0.504 | 0.643 | -0.145 | 0.845 |
| 96.8389735961324 | 0.511 | 0.639 | -0.146 | 0.846 |
| 96.99702491632577 | 0.517 | 0.634 | -0.147 | 0.848 |
| 97.16437337300111 | 0.527 | 0.633 | -0.15 | 0.854 |
| 97.33172182967647 | 0.537 | 0.631 | -0.152 | 0.86 |
| 97.49907028635181 | 0.546 | 0.63 | -0.151 | 0.866 |
| 97.66641874302715 | 0.554 | 0.629 | -0.15 | 0.872 |
| 97.8337671997025 | 0.557 | 0.628 | -0.15 | 0.874 |
| 98.00111565637785 | 0.562 | 0.628 | -0.15 | 0.877 |
| 98.16846411305319 | 0.572 | 0.629 | -0.147 | 0.885 |
| 98.33581256972855 | 0.581 | 0.632 | -0.145 | 0.894 |
| 98.50316102640389 | 0.59 | 0.634 | -0.144 | 0.903 |
| 98.67050948307921 | 0.594 | 0.638 | -0.143 | 0.909 |
| 98.83785793975456 | 0.595 | 0.643 | -0.142 | 0.914 |
| 99.0052063964299 | 0.596 | 0.646 | -0.141 | 0.916 |
| 99.17255485310525 | 0.596 | 0.646 | -0.141 | 0.916 |
| 99.33060617329863 | 0.592 | 0.648 | -0.142 | 0.917 |
| 99.49795462997399 | 0.589 | 0.649 | -0.143 | 0.917 |
| 99.66530308664933 | 0.588 | 0.648 | -0.144 | 0.916 |
| 99.83265154332467 | 0.581 | 0.648 | -0.145 | 0.913 |
| 100.0 | 0.574 | 0.648 | -0.146 | 0.91 |